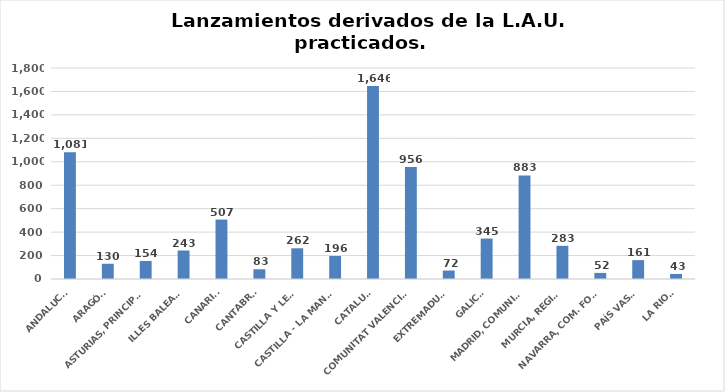
| Category | Series 0 |
|---|---|
| ANDALUCÍA | 1081 |
| ARAGÓN | 130 |
| ASTURIAS, PRINCIPADO | 154 |
| ILLES BALEARS | 243 |
| CANARIAS | 507 |
| CANTABRIA | 83 |
| CASTILLA Y LEÓN | 262 |
| CASTILLA - LA MANCHA | 196 |
| CATALUÑA | 1646 |
| COMUNITAT VALENCIANA | 956 |
| EXTREMADURA | 72 |
| GALICIA | 345 |
| MADRID, COMUNIDAD | 883 |
| MURCIA, REGIÓN | 283 |
| NAVARRA, COM. FORAL | 52 |
| PAÍS VASCO | 161 |
| LA RIOJA | 43 |